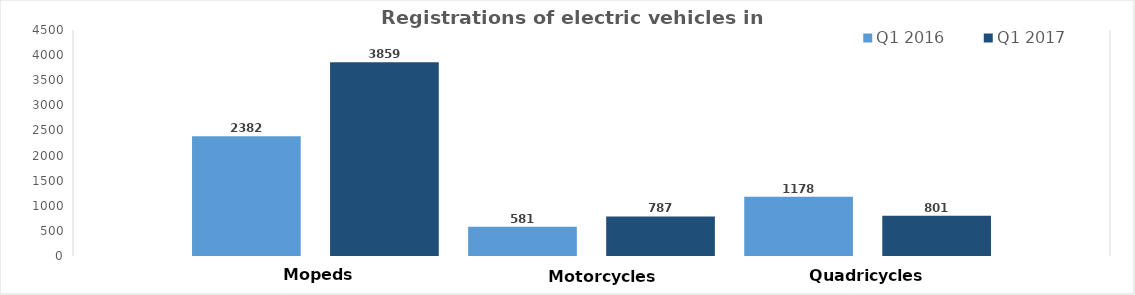
| Category | Q1 2016 | Q1 2017 |
|---|---|---|
| TOTAL | 1178 | 801 |